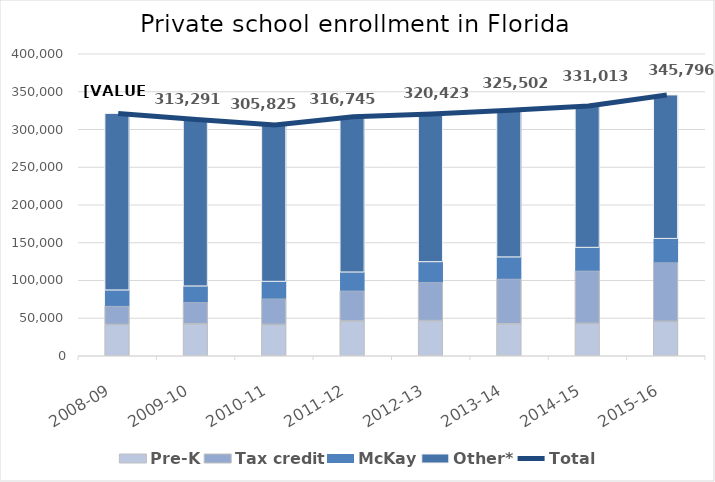
| Category | Pre-K | Tax credit | McKay | Other* |
|---|---|---|---|---|
| 2008-09 | 41425 | 24871 | 20530 | 234472 |
| 2009-10 | 42264 | 28927 | 20926 | 221174 |
| 2010-11 | 41476 | 34550 | 22198 | 207601 |
| 2011-12 | 46194 | 40248 | 24194 | 206109 |
| 2012-13 | 46626 | 51075 | 26611 | 196111 |
| 2013-14 | 42402 | 59822 | 28370 | 194908 |
| 2014-15 | 42929 | 69950 | 30378 | 187756 |
| 2015-16 | 45552 | 78353 | 31173 | 190718 |